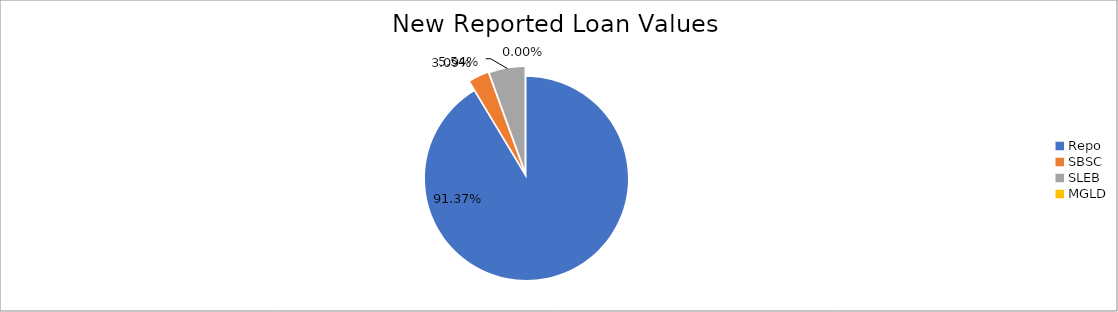
| Category | Series 0 |
|---|---|
| Repo | 8950721.522 |
| SBSC | 302761.761 |
| SLEB | 542641.763 |
| MGLD | 42.854 |